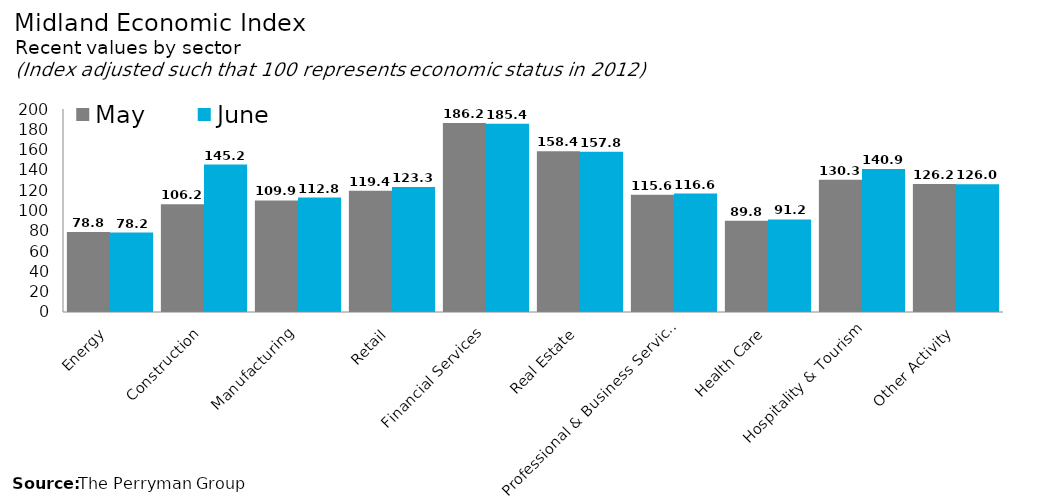
| Category | May | June |
|---|---|---|
| Energy | 78.764 | 78.241 |
| Construction | 106.24 | 145.207 |
| Manufacturing | 109.88 | 112.771 |
| Retail | 119.417 | 123.269 |
| Financial Services | 186.232 | 185.361 |
| Real Estate | 158.444 | 157.843 |
| Professional & Business Services | 115.554 | 116.645 |
| Health Care | 89.842 | 91.224 |
| Hospitality & Tourism | 130.323 | 140.854 |
| Other Activity | 126.214 | 125.97 |